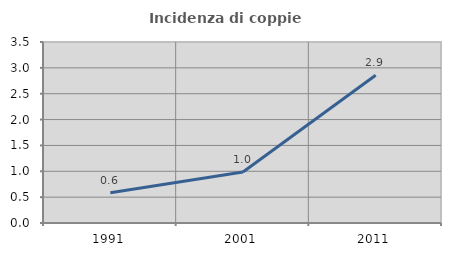
| Category | Incidenza di coppie miste |
|---|---|
| 1991.0 | 0.585 |
| 2001.0 | 0.985 |
| 2011.0 | 2.857 |